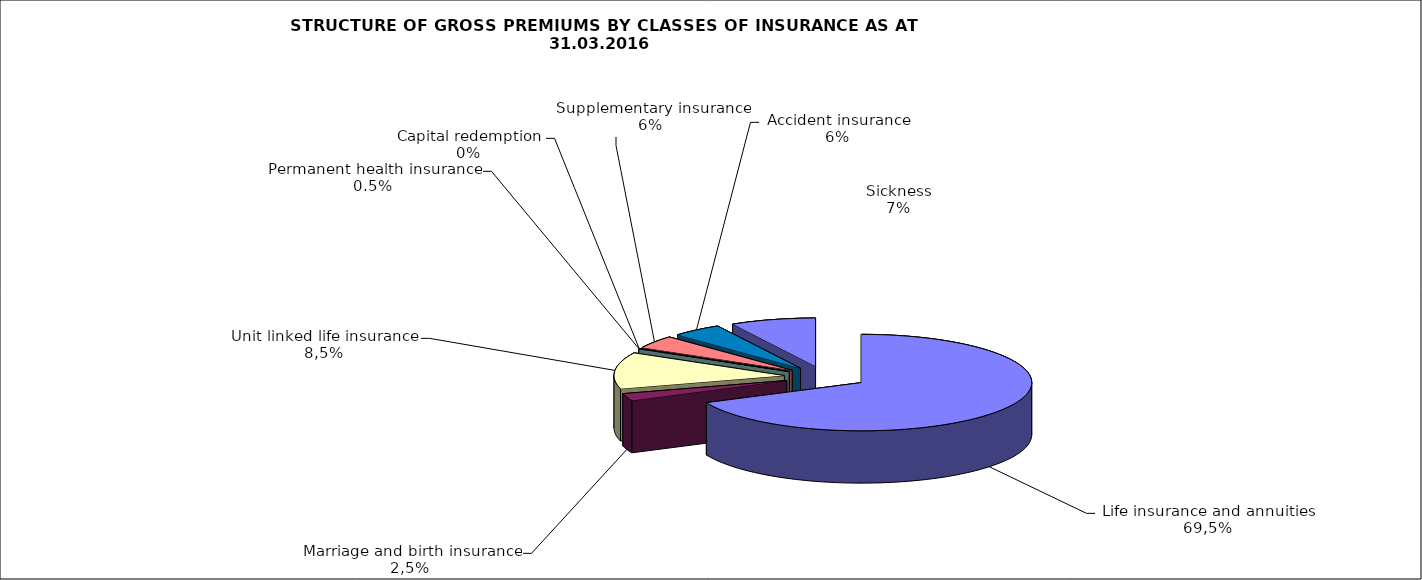
| Category | Series 0 |
|---|---|
| Life insurance and annuities | 77511234.002 |
| Marriage and birth insurance | 2765874.19 |
| Unit linked life insurance | 13874430.094 |
| Permanent health insurance | 79906.47 |
| Capital redemption | 0 |
| Supplementary insurance | 4892659.236 |
| Accident insurance | 5385167.67 |
| Sickness | 9192085.62 |